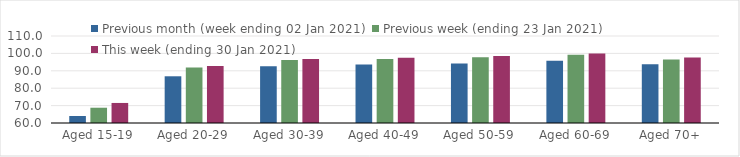
| Category | Previous month (week ending 02 Jan 2021) | Previous week (ending 23 Jan 2021) | This week (ending 30 Jan 2021) |
|---|---|---|---|
| Aged 15-19 | 64.02 | 68.78 | 71.52 |
| Aged 20-29 | 86.85 | 91.85 | 92.8 |
| Aged 30-39 | 92.6 | 96.17 | 96.72 |
| Aged 40-49 | 93.59 | 96.84 | 97.57 |
| Aged 50-59 | 94.15 | 97.72 | 98.44 |
| Aged 60-69 | 95.78 | 99.16 | 99.99 |
| Aged 70+ | 93.74 | 96.49 | 97.64 |